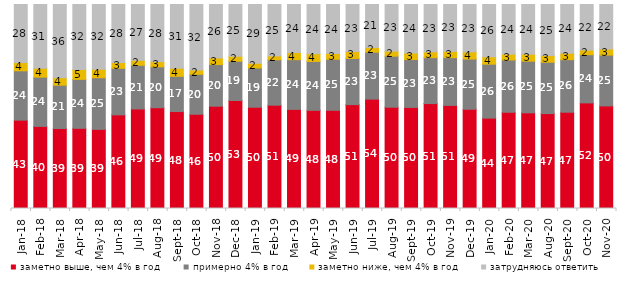
| Category | заметно выше, чем 4% в год | примерно 4% в год | заметно ниже, чем 4% в год | затрудняюсь ответить |
|---|---|---|---|---|
| 2018-01-01 | 43.3 | 24.2 | 4.05 | 28.45 |
| 2018-02-01 | 40.25 | 24.15 | 4.35 | 31.25 |
| 2018-03-01 | 39.2 | 21.25 | 3.7 | 35.85 |
| 2018-04-01 | 39.3 | 24 | 4.85 | 31.85 |
| 2018-05-01 | 38.8 | 25.3 | 4.15 | 31.75 |
| 2018-06-01 | 45.9 | 22.8 | 2.85 | 28.45 |
| 2018-07-01 | 48.8 | 21.4 | 2.45 | 27.35 |
| 2018-08-01 | 49.4 | 20.05 | 2.55 | 28 |
| 2018-09-01 | 47.5 | 17.25 | 4 | 31.2 |
| 2018-10-01 | 46.2 | 19.6 | 2.15 | 32.05 |
| 2018-11-01 | 50.15 | 20.409 | 3.244 | 26.198 |
| 2018-12-01 | 52.95 | 19.25 | 2.4 | 25.4 |
| 2019-01-01 | 49.65 | 19.25 | 2.3 | 28.8 |
| 2019-02-01 | 50.65 | 22.25 | 1.9 | 25.2 |
| 2019-03-01 | 48.583 | 24.366 | 3.531 | 23.521 |
| 2019-04-01 | 48.119 | 23.96 | 3.762 | 24.158 |
| 2019-05-01 | 48.143 | 25.012 | 2.823 | 24.022 |
| 2019-06-01 | 50.923 | 22.643 | 3.392 | 23.042 |
| 2019-07-01 | 53.614 | 23.02 | 2.327 | 21.04 |
| 2019-08-01 | 49.65 | 25.025 | 2.448 | 22.877 |
| 2019-09-01 | 49.554 | 23.465 | 3.168 | 23.812 |
| 2019-10-01 | 51.436 | 22.525 | 2.822 | 23.218 |
| 2019-11-01 | 50.545 | 23.416 | 3.069 | 22.97 |
| 2019-12-01 | 48.663 | 24.604 | 3.515 | 23.218 |
| 2020-01-01 | 44.307 | 26.436 | 3.614 | 25.644 |
| 2020-02-01 | 47.178 | 25.644 | 2.871 | 24.307 |
| 2020-03-01 | 46.901 | 25.335 | 3.421 | 24.343 |
| 2020-08-01 | 46.524 | 25.174 | 3.277 | 25.025 |
| 2020-09-01 | 47.188 | 25.784 | 3.136 | 23.892 |
| 2020-10-01 | 51.769 | 23.617 | 2.292 | 22.322 |
| 2020-11-01 | 50.3 | 24.9 | 2.95 | 21.85 |